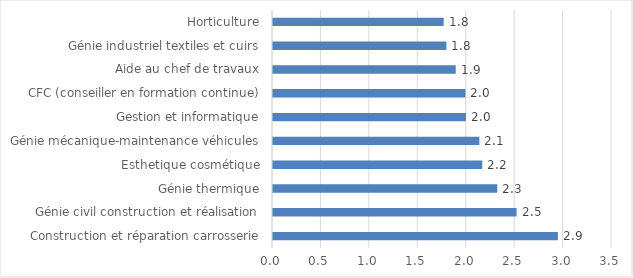
| Category | Proportion d'agents arrêtés au moins une fois (en %) |
|---|---|
| Construction et réparation carrosserie | 2.941 |
| Génie civil construction et réalisation | 2.515 |
| Génie thermique | 2.315 |
| Esthetique cosmétique | 2.16 |
| Génie mécanique-maintenance véhicules | 2.13 |
| Gestion et informatique | 1.992 |
| CFC (conseiller en formation continue) | 1.987 |
| Aide au chef de travaux | 1.887 |
| Génie industriel textiles et cuirs | 1.791 |
| Horticulture | 1.762 |